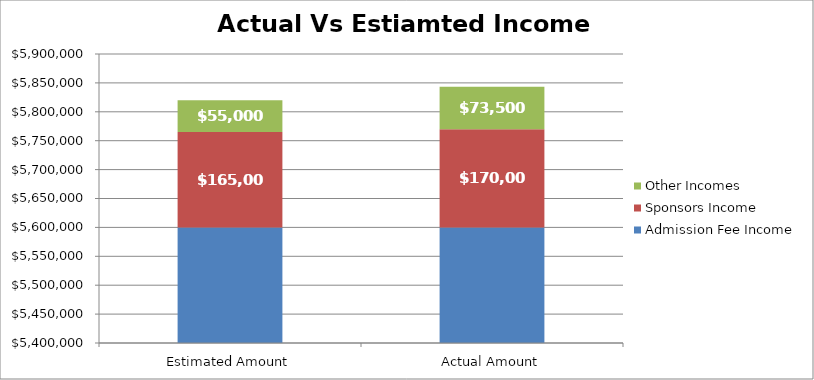
| Category | Admission Fee Income | Sponsors Income | Other Incomes |
|---|---|---|---|
| Estimated Amount | 5600000 | 165000 | 55000 |
| Actual Amount | 5600000 | 170000 | 73500 |